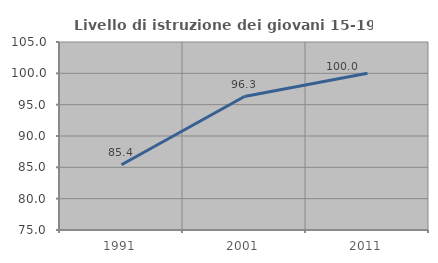
| Category | Livello di istruzione dei giovani 15-19 anni |
|---|---|
| 1991.0 | 85.417 |
| 2001.0 | 96.296 |
| 2011.0 | 100 |